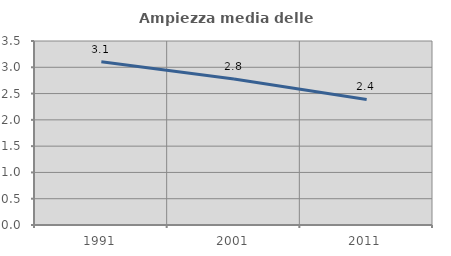
| Category | Ampiezza media delle famiglie |
|---|---|
| 1991.0 | 3.107 |
| 2001.0 | 2.775 |
| 2011.0 | 2.389 |